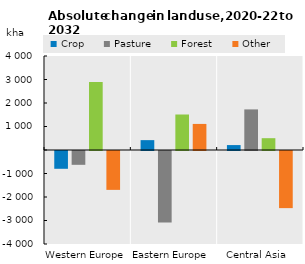
| Category | Crop | Pasture | Forest | Other |
|---|---|---|---|---|
| Western Europe | -757.012 | -588.198 | 2892.82 | -1654.276 |
| Eastern Europe  | 419.708 | -3038.572 | 1510.655 | 1109.58 |
| Central Asia  | 209.292 | 1727.618 | 502.428 | -2430.638 |